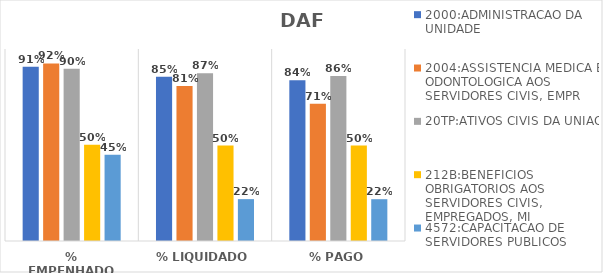
| Category | 2000:ADMINISTRACAO DA UNIDADE | 2004:ASSISTENCIA MEDICA E ODONTOLOGICA AOS SERVIDORES CIVIS, EMPR | 20TP:ATIVOS CIVIS DA UNIAO | 212B:BENEFICIOS OBRIGATORIOS AOS SERVIDORES CIVIS, EMPREGADOS, MI | 4572:CAPACITACAO DE SERVIDORES PUBLICOS FEDERAIS EM PROCESSO DE Q |
|---|---|---|---|---|---|
| % EMPENHADO | 0.908 | 0.925 | 0.898 | 0.501 | 0.449 |
| % LIQUIDADO | 0.855 | 0.808 | 0.873 | 0.497 | 0.218 |
| % PAGO | 0.837 | 0.714 | 0.859 | 0.497 | 0.218 |